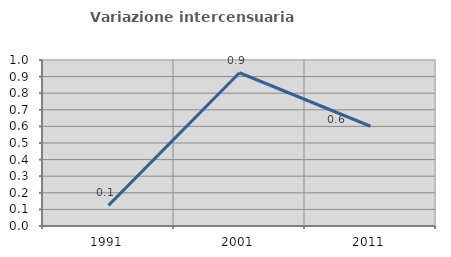
| Category | Variazione intercensuaria annua |
|---|---|
| 1991.0 | 0.124 |
| 2001.0 | 0.923 |
| 2011.0 | 0.601 |